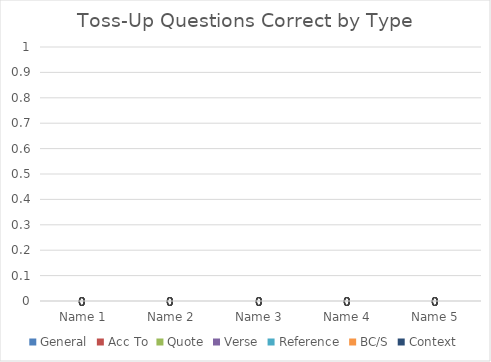
| Category | General | Acc To | Quote | Verse | Reference | BC/S | Context |
|---|---|---|---|---|---|---|---|
| Name 1 | 0 | 0 | 0 | 0 | 0 | 0 | 0 |
| Name 2 | 0 | 0 | 0 | 0 | 0 | 0 | 0 |
| Name 3 | 0 | 0 | 0 | 0 | 0 | 0 | 0 |
| Name 4 | 0 | 0 | 0 | 0 | 0 | 0 | 0 |
| Name 5 | 0 | 0 | 0 | 0 | 0 | 0 | 0 |